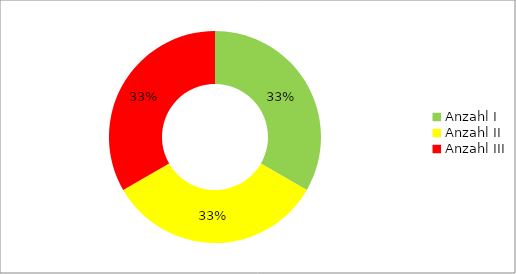
| Category | Series 0 |
|---|---|
| Anzahl I | 1 |
| Anzahl II | 1 |
| Anzahl III | 1 |